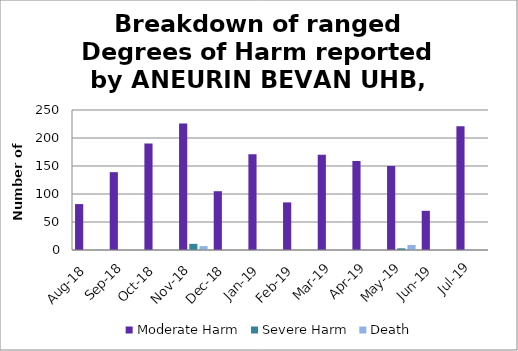
| Category | Moderate Harm | Severe Harm | Death |
|---|---|---|---|
| Aug-18 | 82 | 0 | 1 |
| Sep-18 | 139 | 0 | 0 |
| Oct-18 | 190 | 0 | 0 |
| Nov-18 | 226 | 11 | 7 |
| Dec-18 | 105 | 0 | 0 |
| Jan-19 | 171 | 0 | 0 |
| Feb-19 | 85 | 0 | 0 |
| Mar-19 | 170 | 0 | 0 |
| Apr-19 | 159 | 0 | 0 |
| May-19 | 150 | 3 | 9 |
| Jun-19 | 70 | 0 | 0 |
| Jul-19 | 221 | 0 | 0 |